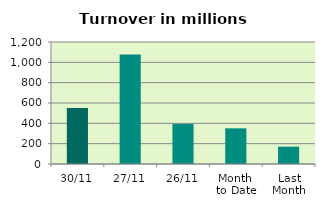
| Category | Series 0 |
|---|---|
| 30/11 | 550.93 |
| 27/11 | 1076.951 |
| 26/11 | 394.395 |
| Month 
to Date | 350.651 |
| Last
Month | 170.355 |